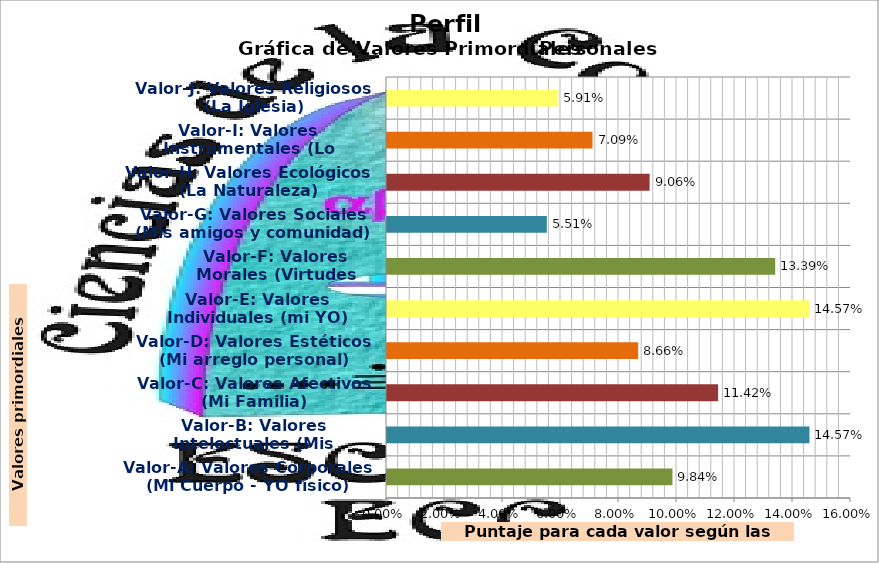
| Category | Series 0 |
|---|---|
| Valor-A: Valores Corporales (Mi Cuerpo - YO físico) | 0.098 |
| Valor-B: Valores Intelectuales (Mis Estudios) | 0.146 |
| Valor-C: Valores Afectivos (Mi Familia) | 0.114 |
| Valor-D: Valores Estéticos (Mi arreglo personal) | 0.087 |
| Valor-E: Valores Individuales (mi YO) | 0.146 |
| Valor-F: Valores Morales (Virtudes parte del YO) | 0.134 |
| Valor-G: Valores Sociales (Mis amigos y comunidad) | 0.055 |
| Valor-H: Valores Ecológicos (La Naturaleza) | 0.091 |
| Valor-I: Valores Instrumentales (Lo Material) | 0.071 |
| Valor-J: Valores Religiosos (La Iglesia) | 0.059 |